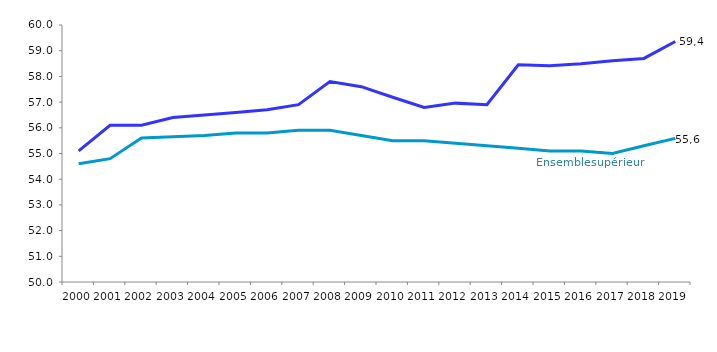
| Category | Ensemble Supérieur | Universités |
|---|---|---|
| 2000.0 | 54.6 | 55.1 |
| 2001.0 | 54.8 | 56.1 |
| 2002.0 | 55.6 | 56.1 |
| 2003.0 | 55.65 | 56.4 |
| 2004.0 | 55.7 | 56.5 |
| 2005.0 | 55.8 | 56.6 |
| 2006.0 | 55.8 | 56.7 |
| 2007.0 | 55.9 | 56.9 |
| 2008.0 | 55.9 | 57.8 |
| 2009.0 | 55.7 | 57.6 |
| 2010.0 | 55.5 | 57.19 |
| 2011.0 | 55.5 | 56.79 |
| 2012.0 | 55.4 | 56.96 |
| 2013.0 | 55.3 | 56.9 |
| 2014.0 | 55.2 | 58.45 |
| 2015.0 | 55.1 | 58.41 |
| 2016.0 | 55.1 | 58.49 |
| 2017.0 | 55 | 58.61 |
| 2018.0 | 55.3 | 58.7 |
| 2019.0 | 55.59 | 59.36 |